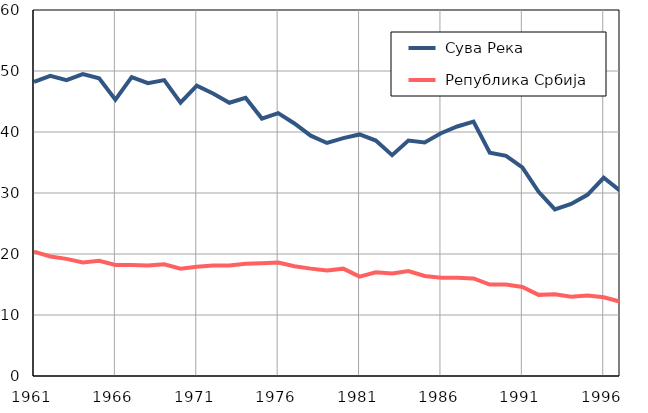
| Category |  Сува Река |  Република Србија |
|---|---|---|
| 1961.0 | 48.2 | 20.4 |
| 1962.0 | 49.2 | 19.6 |
| 1963.0 | 48.5 | 19.2 |
| 1964.0 | 49.5 | 18.6 |
| 1965.0 | 48.8 | 18.9 |
| 1966.0 | 45.3 | 18.2 |
| 1967.0 | 49 | 18.2 |
| 1968.0 | 48 | 18.1 |
| 1969.0 | 48.5 | 18.3 |
| 1970.0 | 44.8 | 17.6 |
| 1971.0 | 47.6 | 17.9 |
| 1972.0 | 46.3 | 18.1 |
| 1973.0 | 44.8 | 18.1 |
| 1974.0 | 45.6 | 18.4 |
| 1975.0 | 42.2 | 18.5 |
| 1976.0 | 43.1 | 18.6 |
| 1977.0 | 41.4 | 18 |
| 1978.0 | 39.4 | 17.6 |
| 1979.0 | 38.2 | 17.3 |
| 1980.0 | 39 | 17.6 |
| 1981.0 | 39.6 | 16.3 |
| 1982.0 | 38.6 | 17 |
| 1983.0 | 36.2 | 16.8 |
| 1984.0 | 38.6 | 17.2 |
| 1985.0 | 38.3 | 16.4 |
| 1986.0 | 39.8 | 16.1 |
| 1987.0 | 40.9 | 16.1 |
| 1988.0 | 41.7 | 16 |
| 1989.0 | 36.6 | 15 |
| 1990.0 | 36.1 | 15 |
| 1991.0 | 34.2 | 14.6 |
| 1992.0 | 30.2 | 13.3 |
| 1993.0 | 27.3 | 13.4 |
| 1994.0 | 28.2 | 13 |
| 1995.0 | 29.7 | 13.2 |
| 1996.0 | 32.5 | 12.9 |
| 1997.0 | 30.4 | 12.2 |